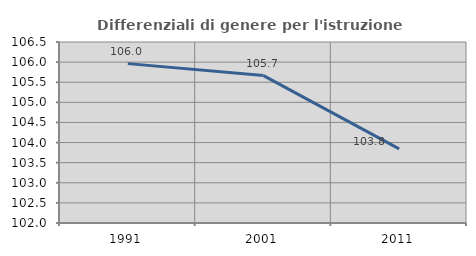
| Category | Differenziali di genere per l'istruzione superiore |
|---|---|
| 1991.0 | 105.962 |
| 2001.0 | 105.665 |
| 2011.0 | 103.843 |